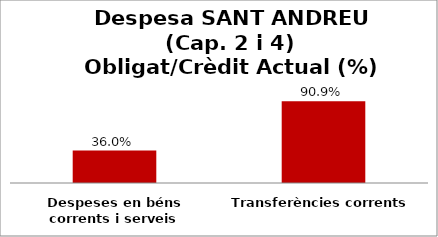
| Category | Series 0 |
|---|---|
| Despeses en béns corrents i serveis | 0.36 |
| Transferències corrents | 0.909 |